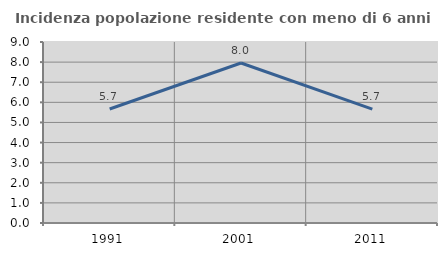
| Category | Incidenza popolazione residente con meno di 6 anni |
|---|---|
| 1991.0 | 5.67 |
| 2001.0 | 7.955 |
| 2011.0 | 5.666 |